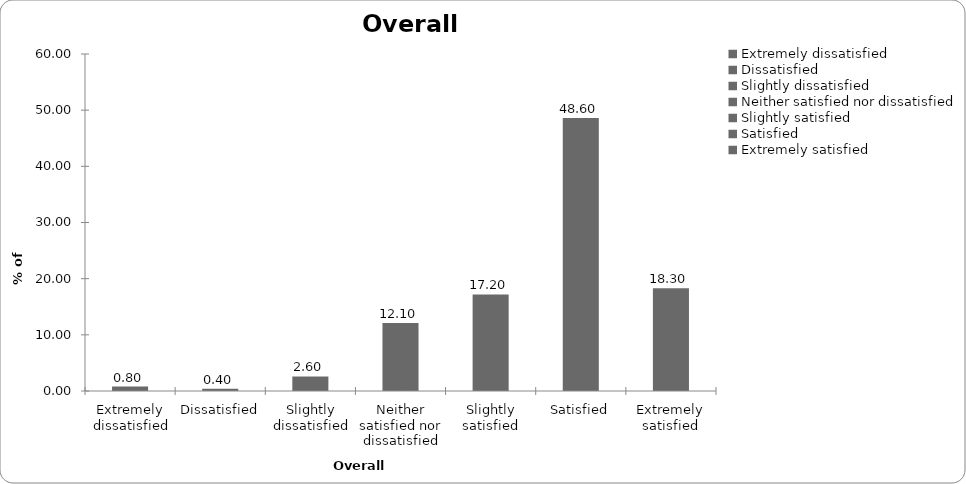
| Category | Overall satisfaction |
|---|---|
| Extremely dissatisfied | 0.8 |
| Dissatisfied | 0.4 |
| Slightly dissatisfied | 2.6 |
| Neither satisfied nor dissatisfied | 12.1 |
| Slightly satisfied | 17.2 |
| Satisfied | 48.6 |
| Extremely satisfied | 18.3 |